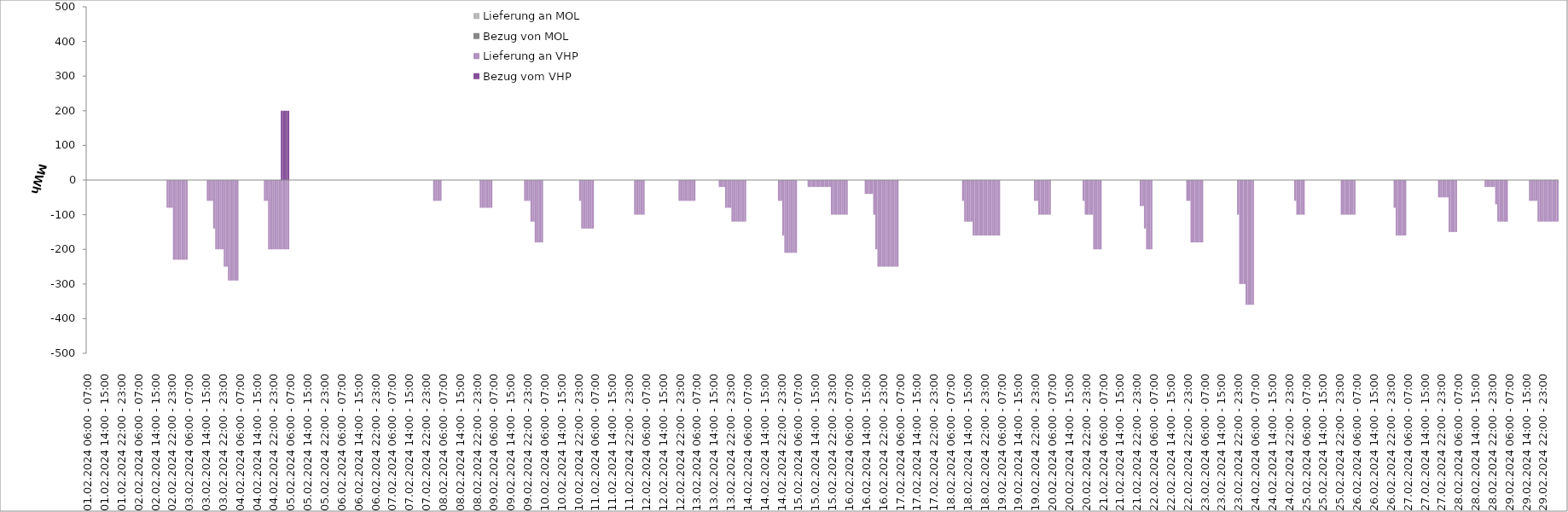
| Category | Bezug vom VHP | Lieferung an VHP | Bezug von MOL | Lieferung an MOL |
|---|---|---|---|---|
| 01.02.2024 06:00 - 07:00 | 0 | 0 | 0 | 0 |
| 01.02.2024 07:00 - 08:00 | 0 | 0 | 0 | 0 |
| 01.02.2024 08:00 - 09:00 | 0 | 0 | 0 | 0 |
| 01.02.2024 09:00 - 10:00 | 0 | 0 | 0 | 0 |
| 01.02.2024 10:00 - 11:00 | 0 | 0 | 0 | 0 |
| 01.02.2024 11:00 - 12:00 | 0 | 0 | 0 | 0 |
| 01.02.2024 12:00 - 13:00 | 0 | 0 | 0 | 0 |
| 01.02.2024 13:00 - 14:00 | 0 | 0 | 0 | 0 |
| 01.02.2024 14:00 - 15:00 | 0 | 0 | 0 | 0 |
| 01.02.2024 15:00 - 16:00 | 0 | 0 | 0 | 0 |
| 01.02.2024 16:00 - 17:00 | 0 | 0 | 0 | 0 |
| 01.02.2024 17:00 - 18:00 | 0 | 0 | 0 | 0 |
| 01.02.2024 18:00 - 19:00 | 0 | 0 | 0 | 0 |
| 01.02.2024 19:00 - 20:00 | 0 | 0 | 0 | 0 |
| 01.02.2024 20:00 - 21:00 | 0 | 0 | 0 | 0 |
| 01.02.2024 21:00 - 22:00 | 0 | 0 | 0 | 0 |
| 01.02.2024 22:00 - 23:00 | 0 | 0 | 0 | 0 |
| 01.02.2024 23:00 - 24:00 | 0 | 0 | 0 | 0 |
| 02.02.2024 00:00 - 01:00 | 0 | 0 | 0 | 0 |
| 02.02.2024 01:00 - 02:00 | 0 | 0 | 0 | 0 |
| 02.02.2024 02:00 - 03:00 | 0 | 0 | 0 | 0 |
| 02.02.2024 03:00 - 04:00 | 0 | 0 | 0 | 0 |
| 02.02.2024 04:00 - 05:00 | 0 | 0 | 0 | 0 |
| 02.02.2024 05:00 - 06:00 | 0 | 0 | 0 | 0 |
| 02.02.2024 06:00 - 07:00 | 0 | 0 | 0 | 0 |
| 02.02.2024 07:00 - 08:00 | 0 | 0 | 0 | 0 |
| 02.02.2024 08:00 - 09:00 | 0 | 0 | 0 | 0 |
| 02.02.2024 09:00 - 10:00 | 0 | 0 | 0 | 0 |
| 02.02.2024 10:00 - 11:00 | 0 | 0 | 0 | 0 |
| 02.02.2024 11:00 - 12:00 | 0 | 0 | 0 | 0 |
| 02.02.2024 12:00 - 13:00 | 0 | 0 | 0 | 0 |
| 02.02.2024 13:00 - 14:00 | 0 | 0 | 0 | 0 |
| 02.02.2024 14:00 - 15:00 | 0 | 0 | 0 | 0 |
| 02.02.2024 15:00 - 16:00 | 0 | 0 | 0 | 0 |
| 02.02.2024 16:00 - 17:00 | 0 | 0 | 0 | 0 |
| 02.02.2024 17:00 - 18:00 | 0 | 0 | 0 | 0 |
| 02.02.2024 18:00 - 19:00 | 0 | 0 | 0 | 0 |
| 02.02.2024 19:00 - 20:00 | 0 | 0 | 0 | 0 |
| 02.02.2024 20:00 - 21:00 | 0 | -80 | 0 | 0 |
| 02.02.2024 21:00 - 22:00 | 0 | -80 | 0 | 0 |
| 02.02.2024 22:00 - 23:00 | 0 | -80 | 0 | 0 |
| 02.02.2024 23:00 - 24:00 | 0 | -230 | 0 | 0 |
| 03.02.2024 00:00 - 01:00 | 0 | -230 | 0 | 0 |
| 03.02.2024 01:00 - 02:00 | 0 | -230 | 0 | 0 |
| 03.02.2024 02:00 - 03:00 | 0 | -230 | 0 | 0 |
| 03.02.2024 03:00 - 04:00 | 0 | -230 | 0 | 0 |
| 03.02.2024 04:00 - 05:00 | 0 | -230 | 0 | 0 |
| 03.02.2024 05:00 - 06:00 | 0 | -230 | 0 | 0 |
| 03.02.2024 06:00 - 07:00 | 0 | 0 | 0 | 0 |
| 03.02.2024 07:00 - 08:00 | 0 | 0 | 0 | 0 |
| 03.02.2024 08:00 - 09:00 | 0 | 0 | 0 | 0 |
| 03.02.2024 09:00 - 10:00 | 0 | 0 | 0 | 0 |
| 03.02.2024 10:00 - 11:00 | 0 | 0 | 0 | 0 |
| 03.02.2024 11:00 - 12:00 | 0 | 0 | 0 | 0 |
| 03.02.2024 12:00 - 13:00 | 0 | 0 | 0 | 0 |
| 03.02.2024 13:00 - 14:00 | 0 | 0 | 0 | 0 |
| 03.02.2024 14:00 - 15:00 | 0 | 0 | 0 | 0 |
| 03.02.2024 15:00 - 16:00 | 0 | -60 | 0 | 0 |
| 03.02.2024 16:00 - 17:00 | 0 | -60 | 0 | 0 |
| 03.02.2024 17:00 - 18:00 | 0 | -60 | 0 | 0 |
| 03.02.2024 18:00 - 19:00 | 0 | -140 | 0 | 0 |
| 03.02.2024 19:00 - 20:00 | 0 | -200 | 0 | 0 |
| 03.02.2024 20:00 - 21:00 | 0 | -200 | 0 | 0 |
| 03.02.2024 21:00 - 22:00 | 0 | -200 | 0 | 0 |
| 03.02.2024 22:00 - 23:00 | 0 | -200 | 0 | 0 |
| 03.02.2024 23:00 - 24:00 | 0 | -250 | 0 | 0 |
| 04.02.2024 00:00 - 01:00 | 0 | -250 | 0 | 0 |
| 04.02.2024 01:00 - 02:00 | 0 | -290 | 0 | 0 |
| 04.02.2024 02:00 - 03:00 | 0 | -290 | 0 | 0 |
| 04.02.2024 03:00 - 04:00 | 0 | -290 | 0 | 0 |
| 04.02.2024 04:00 - 05:00 | 0 | -290 | 0 | 0 |
| 04.02.2024 05:00 - 06:00 | 0 | -290 | 0 | 0 |
| 04.02.2024 06:00 - 07:00 | 0 | 0 | 0 | 0 |
| 04.02.2024 07:00 - 08:00 | 0 | 0 | 0 | 0 |
| 04.02.2024 08:00 - 09:00 | 0 | 0 | 0 | 0 |
| 04.02.2024 09:00 - 10:00 | 0 | 0 | 0 | 0 |
| 04.02.2024 10:00 - 11:00 | 0 | 0 | 0 | 0 |
| 04.02.2024 11:00 - 12:00 | 0 | 0 | 0 | 0 |
| 04.02.2024 12:00 - 13:00 | 0 | 0 | 0 | 0 |
| 04.02.2024 13:00 - 14:00 | 0 | 0 | 0 | 0 |
| 04.02.2024 14:00 - 15:00 | 0 | 0 | 0 | 0 |
| 04.02.2024 15:00 - 16:00 | 0 | 0 | 0 | 0 |
| 04.02.2024 16:00 - 17:00 | 0 | 0 | 0 | 0 |
| 04.02.2024 17:00 - 18:00 | 0 | 0 | 0 | 0 |
| 04.02.2024 18:00 - 19:00 | 0 | -60 | 0 | 0 |
| 04.02.2024 19:00 - 20:00 | 0 | -60 | 0 | 0 |
| 04.02.2024 20:00 - 21:00 | 0 | -200 | 0 | 0 |
| 04.02.2024 21:00 - 22:00 | 0 | -200 | 0 | 0 |
| 04.02.2024 22:00 - 23:00 | 0 | -200 | 0 | 0 |
| 04.02.2024 23:00 - 24:00 | 0 | -200 | 0 | 0 |
| 05.02.2024 00:00 - 01:00 | 0 | -200 | 0 | 0 |
| 05.02.2024 01:00 - 02:00 | 0 | -200 | 0 | 0 |
| 05.02.2024 02:00 - 03:00 | 200 | -200 | 0 | 0 |
| 05.02.2024 03:00 - 04:00 | 200 | -200 | 0 | 0 |
| 05.02.2024 04:00 - 05:00 | 200 | -200 | 0 | 0 |
| 05.02.2024 05:00 - 06:00 | 200 | -200 | 0 | 0 |
| 05.02.2024 06:00 - 07:00 | 0 | 0 | 0 | 0 |
| 05.02.2024 07:00 - 08:00 | 0 | 0 | 0 | 0 |
| 05.02.2024 08:00 - 09:00 | 0 | 0 | 0 | 0 |
| 05.02.2024 09:00 - 10:00 | 0 | 0 | 0 | 0 |
| 05.02.2024 10:00 - 11:00 | 0 | 0 | 0 | 0 |
| 05.02.2024 11:00 - 12:00 | 0 | 0 | 0 | 0 |
| 05.02.2024 12:00 - 13:00 | 0 | 0 | 0 | 0 |
| 05.02.2024 13:00 - 14:00 | 0 | 0 | 0 | 0 |
| 05.02.2024 14:00 - 15:00 | 0 | 0 | 0 | 0 |
| 05.02.2024 15:00 - 16:00 | 0 | 0 | 0 | 0 |
| 05.02.2024 16:00 - 17:00 | 0 | 0 | 0 | 0 |
| 05.02.2024 17:00 - 18:00 | 0 | 0 | 0 | 0 |
| 05.02.2024 18:00 - 19:00 | 0 | 0 | 0 | 0 |
| 05.02.2024 19:00 - 20:00 | 0 | 0 | 0 | 0 |
| 05.02.2024 20:00 - 21:00 | 0 | 0 | 0 | 0 |
| 05.02.2024 21:00 - 22:00 | 0 | 0 | 0 | 0 |
| 05.02.2024 22:00 - 23:00 | 0 | 0 | 0 | 0 |
| 05.02.2024 23:00 - 24:00 | 0 | 0 | 0 | 0 |
| 06.02.2024 00:00 - 01:00 | 0 | 0 | 0 | 0 |
| 06.02.2024 01:00 - 02:00 | 0 | 0 | 0 | 0 |
| 06.02.2024 02:00 - 03:00 | 0 | 0 | 0 | 0 |
| 06.02.2024 03:00 - 04:00 | 0 | 0 | 0 | 0 |
| 06.02.2024 04:00 - 05:00 | 0 | 0 | 0 | 0 |
| 06.02.2024 05:00 - 06:00 | 0 | 0 | 0 | 0 |
| 06.02.2024 06:00 - 07:00 | 0 | 0 | 0 | 0 |
| 06.02.2024 07:00 - 08:00 | 0 | 0 | 0 | 0 |
| 06.02.2024 08:00 - 09:00 | 0 | 0 | 0 | 0 |
| 06.02.2024 09:00 - 10:00 | 0 | 0 | 0 | 0 |
| 06.02.2024 10:00 - 11:00 | 0 | 0 | 0 | 0 |
| 06.02.2024 11:00 - 12:00 | 0 | 0 | 0 | 0 |
| 06.02.2024 12:00 - 13:00 | 0 | 0 | 0 | 0 |
| 06.02.2024 13:00 - 14:00 | 0 | 0 | 0 | 0 |
| 06.02.2024 14:00 - 15:00 | 0 | 0 | 0 | 0 |
| 06.02.2024 15:00 - 16:00 | 0 | 0 | 0 | 0 |
| 06.02.2024 16:00 - 17:00 | 0 | 0 | 0 | 0 |
| 06.02.2024 17:00 - 18:00 | 0 | 0 | 0 | 0 |
| 06.02.2024 18:00 - 19:00 | 0 | 0 | 0 | 0 |
| 06.02.2024 19:00 - 20:00 | 0 | 0 | 0 | 0 |
| 06.02.2024 20:00 - 21:00 | 0 | 0 | 0 | 0 |
| 06.02.2024 21:00 - 22:00 | 0 | 0 | 0 | 0 |
| 06.02.2024 22:00 - 23:00 | 0 | 0 | 0 | 0 |
| 06.02.2024 23:00 - 24:00 | 0 | 0 | 0 | 0 |
| 07.02.2024 00:00 - 01:00 | 0 | 0 | 0 | 0 |
| 07.02.2024 01:00 - 02:00 | 0 | 0 | 0 | 0 |
| 07.02.2024 02:00 - 03:00 | 0 | 0 | 0 | 0 |
| 07.02.2024 03:00 - 04:00 | 0 | 0 | 0 | 0 |
| 07.02.2024 04:00 - 05:00 | 0 | 0 | 0 | 0 |
| 07.02.2024 05:00 - 06:00 | 0 | 0 | 0 | 0 |
| 07.02.2024 06:00 - 07:00 | 0 | 0 | 0 | 0 |
| 07.02.2024 07:00 - 08:00 | 0 | 0 | 0 | 0 |
| 07.02.2024 08:00 - 09:00 | 0 | 0 | 0 | 0 |
| 07.02.2024 09:00 - 10:00 | 0 | 0 | 0 | 0 |
| 07.02.2024 10:00 - 11:00 | 0 | 0 | 0 | 0 |
| 07.02.2024 11:00 - 12:00 | 0 | 0 | 0 | 0 |
| 07.02.2024 12:00 - 13:00 | 0 | 0 | 0 | 0 |
| 07.02.2024 13:00 - 14:00 | 0 | 0 | 0 | 0 |
| 07.02.2024 14:00 - 15:00 | 0 | 0 | 0 | 0 |
| 07.02.2024 15:00 - 16:00 | 0 | 0 | 0 | 0 |
| 07.02.2024 16:00 - 17:00 | 0 | 0 | 0 | 0 |
| 07.02.2024 17:00 - 18:00 | 0 | 0 | 0 | 0 |
| 07.02.2024 18:00 - 19:00 | 0 | 0 | 0 | 0 |
| 07.02.2024 19:00 - 20:00 | 0 | 0 | 0 | 0 |
| 07.02.2024 20:00 - 21:00 | 0 | 0 | 0 | 0 |
| 07.02.2024 21:00 - 22:00 | 0 | 0 | 0 | 0 |
| 07.02.2024 22:00 - 23:00 | 0 | 0 | 0 | 0 |
| 07.02.2024 23:00 - 24:00 | 0 | 0 | 0 | 0 |
| 08.02.2024 00:00 - 01:00 | 0 | 0 | 0 | 0 |
| 08.02.2024 01:00 - 02:00 | 0 | 0 | 0 | 0 |
| 08.02.2024 02:00 - 03:00 | 0 | -60 | 0 | 0 |
| 08.02.2024 03:00 - 04:00 | 0 | -60 | 0 | 0 |
| 08.02.2024 04:00 - 05:00 | 0 | -60 | 0 | 0 |
| 08.02.2024 05:00 - 06:00 | 0 | -60 | 0 | 0 |
| 08.02.2024 06:00 - 07:00 | 0 | 0 | 0 | 0 |
| 08.02.2024 07:00 - 08:00 | 0 | 0 | 0 | 0 |
| 08.02.2024 08:00 - 09:00 | 0 | 0 | 0 | 0 |
| 08.02.2024 09:00 - 10:00 | 0 | 0 | 0 | 0 |
| 08.02.2024 10:00 - 11:00 | 0 | 0 | 0 | 0 |
| 08.02.2024 11:00 - 12:00 | 0 | 0 | 0 | 0 |
| 08.02.2024 12:00 - 13:00 | 0 | 0 | 0 | 0 |
| 08.02.2024 13:00 - 14:00 | 0 | 0 | 0 | 0 |
| 08.02.2024 14:00 - 15:00 | 0 | 0 | 0 | 0 |
| 08.02.2024 15:00 - 16:00 | 0 | 0 | 0 | 0 |
| 08.02.2024 16:00 - 17:00 | 0 | 0 | 0 | 0 |
| 08.02.2024 17:00 - 18:00 | 0 | 0 | 0 | 0 |
| 08.02.2024 18:00 - 19:00 | 0 | 0 | 0 | 0 |
| 08.02.2024 19:00 - 20:00 | 0 | 0 | 0 | 0 |
| 08.02.2024 20:00 - 21:00 | 0 | 0 | 0 | 0 |
| 08.02.2024 21:00 - 22:00 | 0 | 0 | 0 | 0 |
| 08.02.2024 22:00 - 23:00 | 0 | 0 | 0 | 0 |
| 08.02.2024 23:00 - 24:00 | 0 | 0 | 0 | 0 |
| 09.02.2024 00:00 - 01:00 | 0 | -80 | 0 | 0 |
| 09.02.2024 01:00 - 02:00 | 0 | -80 | 0 | 0 |
| 09.02.2024 02:00 - 03:00 | 0 | -80 | 0 | 0 |
| 09.02.2024 03:00 - 04:00 | 0 | -80 | 0 | 0 |
| 09.02.2024 04:00 - 05:00 | 0 | -80 | 0 | 0 |
| 09.02.2024 05:00 - 06:00 | 0 | -80 | 0 | 0 |
| 09.02.2024 06:00 - 07:00 | 0 | 0 | 0 | 0 |
| 09.02.2024 07:00 - 08:00 | 0 | 0 | 0 | 0 |
| 09.02.2024 08:00 - 09:00 | 0 | 0 | 0 | 0 |
| 09.02.2024 09:00 - 10:00 | 0 | 0 | 0 | 0 |
| 09.02.2024 10:00 - 11:00 | 0 | 0 | 0 | 0 |
| 09.02.2024 11:00 - 12:00 | 0 | 0 | 0 | 0 |
| 09.02.2024 12:00 - 13:00 | 0 | 0 | 0 | 0 |
| 09.02.2024 13:00 - 14:00 | 0 | 0 | 0 | 0 |
| 09.02.2024 14:00 - 15:00 | 0 | 0 | 0 | 0 |
| 09.02.2024 15:00 - 16:00 | 0 | 0 | 0 | 0 |
| 09.02.2024 16:00 - 17:00 | 0 | 0 | 0 | 0 |
| 09.02.2024 17:00 - 18:00 | 0 | 0 | 0 | 0 |
| 09.02.2024 18:00 - 19:00 | 0 | 0 | 0 | 0 |
| 09.02.2024 19:00 - 20:00 | 0 | 0 | 0 | 0 |
| 09.02.2024 20:00 - 21:00 | 0 | 0 | 0 | 0 |
| 09.02.2024 21:00 - 22:00 | 0 | -60 | 0 | 0 |
| 09.02.2024 22:00 - 23:00 | 0 | -60 | 0 | 0 |
| 09.02.2024 23:00 - 24:00 | 0 | -60 | 0 | 0 |
| 10.02.2024 00:00 - 01:00 | 0 | -120 | 0 | 0 |
| 10.02.2024 01:00 - 02:00 | 0 | -120 | 0 | 0 |
| 10.02.2024 02:00 - 03:00 | 0 | -180 | 0 | 0 |
| 10.02.2024 03:00 - 04:00 | 0 | -180 | 0 | 0 |
| 10.02.2024 04:00 - 05:00 | 0 | -180 | 0 | 0 |
| 10.02.2024 05:00 - 06:00 | 0 | -180 | 0 | 0 |
| 10.02.2024 06:00 - 07:00 | 0 | 0 | 0 | 0 |
| 10.02.2024 07:00 - 08:00 | 0 | 0 | 0 | 0 |
| 10.02.2024 08:00 - 09:00 | 0 | 0 | 0 | 0 |
| 10.02.2024 09:00 - 10:00 | 0 | 0 | 0 | 0 |
| 10.02.2024 10:00 - 11:00 | 0 | 0 | 0 | 0 |
| 10.02.2024 11:00 - 12:00 | 0 | 0 | 0 | 0 |
| 10.02.2024 12:00 - 13:00 | 0 | 0 | 0 | 0 |
| 10.02.2024 13:00 - 14:00 | 0 | 0 | 0 | 0 |
| 10.02.2024 14:00 - 15:00 | 0 | 0 | 0 | 0 |
| 10.02.2024 15:00 - 16:00 | 0 | 0 | 0 | 0 |
| 10.02.2024 16:00 - 17:00 | 0 | 0 | 0 | 0 |
| 10.02.2024 17:00 - 18:00 | 0 | 0 | 0 | 0 |
| 10.02.2024 18:00 - 19:00 | 0 | 0 | 0 | 0 |
| 10.02.2024 19:00 - 20:00 | 0 | 0 | 0 | 0 |
| 10.02.2024 20:00 - 21:00 | 0 | 0 | 0 | 0 |
| 10.02.2024 21:00 - 22:00 | 0 | 0 | 0 | 0 |
| 10.02.2024 22:00 - 23:00 | 0 | 0 | 0 | 0 |
| 10.02.2024 23:00 - 24:00 | 0 | -60 | 0 | 0 |
| 11.02.2024 00:00 - 01:00 | 0 | -140 | 0 | 0 |
| 11.02.2024 01:00 - 02:00 | 0 | -140 | 0 | 0 |
| 11.02.2024 02:00 - 03:00 | 0 | -140 | 0 | 0 |
| 11.02.2024 03:00 - 04:00 | 0 | -140 | 0 | 0 |
| 11.02.2024 04:00 - 05:00 | 0 | -140 | 0 | 0 |
| 11.02.2024 05:00 - 06:00 | 0 | -140 | 0 | 0 |
| 11.02.2024 06:00 - 07:00 | 0 | 0 | 0 | 0 |
| 11.02.2024 07:00 - 08:00 | 0 | 0 | 0 | 0 |
| 11.02.2024 08:00 - 09:00 | 0 | 0 | 0 | 0 |
| 11.02.2024 09:00 - 10:00 | 0 | 0 | 0 | 0 |
| 11.02.2024 10:00 - 11:00 | 0 | 0 | 0 | 0 |
| 11.02.2024 11:00 - 12:00 | 0 | 0 | 0 | 0 |
| 11.02.2024 12:00 - 13:00 | 0 | 0 | 0 | 0 |
| 11.02.2024 13:00 - 14:00 | 0 | 0 | 0 | 0 |
| 11.02.2024 14:00 - 15:00 | 0 | 0 | 0 | 0 |
| 11.02.2024 15:00 - 16:00 | 0 | 0 | 0 | 0 |
| 11.02.2024 16:00 - 17:00 | 0 | 0 | 0 | 0 |
| 11.02.2024 17:00 - 18:00 | 0 | 0 | 0 | 0 |
| 11.02.2024 18:00 - 19:00 | 0 | 0 | 0 | 0 |
| 11.02.2024 19:00 - 20:00 | 0 | 0 | 0 | 0 |
| 11.02.2024 20:00 - 21:00 | 0 | 0 | 0 | 0 |
| 11.02.2024 21:00 - 22:00 | 0 | 0 | 0 | 0 |
| 11.02.2024 22:00 - 23:00 | 0 | 0 | 0 | 0 |
| 11.02.2024 23:00 - 24:00 | 0 | 0 | 0 | 0 |
| 12.02.2024 00:00 - 01:00 | 0 | 0 | 0 | 0 |
| 12.02.2024 01:00 - 02:00 | 0 | -100 | 0 | 0 |
| 12.02.2024 02:00 - 03:00 | 0 | -100 | 0 | 0 |
| 12.02.2024 03:00 - 04:00 | 0 | -100 | 0 | 0 |
| 12.02.2024 04:00 - 05:00 | 0 | -100 | 0 | 0 |
| 12.02.2024 05:00 - 06:00 | 0 | -100 | 0 | 0 |
| 12.02.2024 06:00 - 07:00 | 0 | 0 | 0 | 0 |
| 12.02.2024 07:00 - 08:00 | 0 | 0 | 0 | 0 |
| 12.02.2024 08:00 - 09:00 | 0 | 0 | 0 | 0 |
| 12.02.2024 09:00 - 10:00 | 0 | 0 | 0 | 0 |
| 12.02.2024 10:00 - 11:00 | 0 | 0 | 0 | 0 |
| 12.02.2024 11:00 - 12:00 | 0 | 0 | 0 | 0 |
| 12.02.2024 12:00 - 13:00 | 0 | 0 | 0 | 0 |
| 12.02.2024 13:00 - 14:00 | 0 | 0 | 0 | 0 |
| 12.02.2024 14:00 - 15:00 | 0 | 0 | 0 | 0 |
| 12.02.2024 15:00 - 16:00 | 0 | 0 | 0 | 0 |
| 12.02.2024 16:00 - 17:00 | 0 | 0 | 0 | 0 |
| 12.02.2024 17:00 - 18:00 | 0 | 0 | 0 | 0 |
| 12.02.2024 18:00 - 19:00 | 0 | 0 | 0 | 0 |
| 12.02.2024 19:00 - 20:00 | 0 | 0 | 0 | 0 |
| 12.02.2024 20:00 - 21:00 | 0 | 0 | 0 | 0 |
| 12.02.2024 21:00 - 22:00 | 0 | 0 | 0 | 0 |
| 12.02.2024 22:00 - 23:00 | 0 | -60 | 0 | 0 |
| 12.02.2024 23:00 - 24:00 | 0 | -60 | 0 | 0 |
| 13.02.2024 00:00 - 01:00 | 0 | -60 | 0 | 0 |
| 13.02.2024 01:00 - 02:00 | 0 | -60 | 0 | 0 |
| 13.02.2024 02:00 - 03:00 | 0 | -60 | 0 | 0 |
| 13.02.2024 03:00 - 04:00 | 0 | -60 | 0 | 0 |
| 13.02.2024 04:00 - 05:00 | 0 | -60 | 0 | 0 |
| 13.02.2024 05:00 - 06:00 | 0 | -60 | 0 | 0 |
| 13.02.2024 06:00 - 07:00 | 0 | 0 | 0 | 0 |
| 13.02.2024 07:00 - 08:00 | 0 | 0 | 0 | 0 |
| 13.02.2024 08:00 - 09:00 | 0 | 0 | 0 | 0 |
| 13.02.2024 09:00 - 10:00 | 0 | 0 | 0 | 0 |
| 13.02.2024 10:00 - 11:00 | 0 | 0 | 0 | 0 |
| 13.02.2024 11:00 - 12:00 | 0 | 0 | 0 | 0 |
| 13.02.2024 12:00 - 13:00 | 0 | 0 | 0 | 0 |
| 13.02.2024 13:00 - 14:00 | 0 | 0 | 0 | 0 |
| 13.02.2024 14:00 - 15:00 | 0 | 0 | 0 | 0 |
| 13.02.2024 15:00 - 16:00 | 0 | 0 | 0 | 0 |
| 13.02.2024 16:00 - 17:00 | 0 | 0 | 0 | 0 |
| 13.02.2024 17:00 - 18:00 | 0 | -20 | 0 | 0 |
| 13.02.2024 18:00 - 19:00 | 0 | -20 | 0 | 0 |
| 13.02.2024 19:00 - 20:00 | 0 | -20 | 0 | 0 |
| 13.02.2024 20:00 - 21:00 | 0 | -80 | 0 | 0 |
| 13.02.2024 21:00 - 22:00 | 0 | -80 | 0 | 0 |
| 13.02.2024 22:00 - 23:00 | 0 | -80 | 0 | 0 |
| 13.02.2024 23:00 - 24:00 | 0 | -120 | 0 | 0 |
| 14.02.2024 00:00 - 01:00 | 0 | -120 | 0 | 0 |
| 14.02.2024 01:00 - 02:00 | 0 | -120 | 0 | 0 |
| 14.02.2024 02:00 - 03:00 | 0 | -120 | 0 | 0 |
| 14.02.2024 03:00 - 04:00 | 0 | -120 | 0 | 0 |
| 14.02.2024 04:00 - 05:00 | 0 | -120 | 0 | 0 |
| 14.02.2024 05:00 - 06:00 | 0 | -120 | 0 | 0 |
| 14.02.2024 06:00 - 07:00 | 0 | 0 | 0 | 0 |
| 14.02.2024 07:00 - 08:00 | 0 | 0 | 0 | 0 |
| 14.02.2024 08:00 - 09:00 | 0 | 0 | 0 | 0 |
| 14.02.2024 09:00 - 10:00 | 0 | 0 | 0 | 0 |
| 14.02.2024 10:00 - 11:00 | 0 | 0 | 0 | 0 |
| 14.02.2024 11:00 - 12:00 | 0 | 0 | 0 | 0 |
| 14.02.2024 12:00 - 13:00 | 0 | 0 | 0 | 0 |
| 14.02.2024 13:00 - 14:00 | 0 | 0 | 0 | 0 |
| 14.02.2024 14:00 - 15:00 | 0 | 0 | 0 | 0 |
| 14.02.2024 15:00 - 16:00 | 0 | 0 | 0 | 0 |
| 14.02.2024 16:00 - 17:00 | 0 | 0 | 0 | 0 |
| 14.02.2024 17:00 - 18:00 | 0 | 0 | 0 | 0 |
| 14.02.2024 18:00 - 19:00 | 0 | 0 | 0 | 0 |
| 14.02.2024 19:00 - 20:00 | 0 | 0 | 0 | 0 |
| 14.02.2024 20:00 - 21:00 | 0 | 0 | 0 | 0 |
| 14.02.2024 21:00 - 22:00 | 0 | -60 | 0 | 0 |
| 14.02.2024 22:00 - 23:00 | 0 | -60 | 0 | 0 |
| 14.02.2024 23:00 - 24:00 | 0 | -160 | 0 | 0 |
| 15.02.2024 00:00 - 01:00 | 0 | -210 | 0 | 0 |
| 15.02.2024 01:00 - 02:00 | 0 | -210 | 0 | 0 |
| 15.02.2024 02:00 - 03:00 | 0 | -210 | 0 | 0 |
| 15.02.2024 03:00 - 04:00 | 0 | -210 | 0 | 0 |
| 15.02.2024 04:00 - 05:00 | 0 | -210 | 0 | 0 |
| 15.02.2024 05:00 - 06:00 | 0 | -210 | 0 | 0 |
| 15.02.2024 06:00 - 07:00 | 0 | 0 | 0 | 0 |
| 15.02.2024 07:00 - 08:00 | 0 | 0 | 0 | 0 |
| 15.02.2024 08:00 - 09:00 | 0 | 0 | 0 | 0 |
| 15.02.2024 09:00 - 10:00 | 0 | 0 | 0 | 0 |
| 15.02.2024 10:00 - 11:00 | 0 | 0 | 0 | 0 |
| 15.02.2024 11:00 - 12:00 | 0 | -20 | 0 | 0 |
| 15.02.2024 12:00 - 13:00 | 0 | -20 | 0 | 0 |
| 15.02.2024 13:00 - 14:00 | 0 | -20 | 0 | 0 |
| 15.02.2024 14:00 - 15:00 | 0 | -20 | 0 | 0 |
| 15.02.2024 15:00 - 16:00 | 0 | -20 | 0 | 0 |
| 15.02.2024 16:00 - 17:00 | 0 | -20 | 0 | 0 |
| 15.02.2024 17:00 - 18:00 | 0 | -20 | 0 | 0 |
| 15.02.2024 18:00 - 19:00 | 0 | -20 | 0 | 0 |
| 15.02.2024 19:00 - 20:00 | 0 | -20 | 0 | 0 |
| 15.02.2024 20:00 - 21:00 | 0 | -20 | 0 | 0 |
| 15.02.2024 21:00 - 22:00 | 0 | -20 | 0 | 0 |
| 15.02.2024 22:00 - 23:00 | 0 | -100 | 0 | 0 |
| 15.02.2024 23:00 - 24:00 | 0 | -100 | 0 | 0 |
| 16.02.2024 00:00 - 01:00 | 0 | -100 | 0 | 0 |
| 16.02.2024 01:00 - 02:00 | 0 | -100 | 0 | 0 |
| 16.02.2024 02:00 - 03:00 | 0 | -100 | 0 | 0 |
| 16.02.2024 03:00 - 04:00 | 0 | -100 | 0 | 0 |
| 16.02.2024 04:00 - 05:00 | 0 | -100 | 0 | 0 |
| 16.02.2024 05:00 - 06:00 | 0 | -100 | 0 | 0 |
| 16.02.2024 06:00 - 07:00 | 0 | 0 | 0 | 0 |
| 16.02.2024 07:00 - 08:00 | 0 | 0 | 0 | 0 |
| 16.02.2024 08:00 - 09:00 | 0 | 0 | 0 | 0 |
| 16.02.2024 09:00 - 10:00 | 0 | 0 | 0 | 0 |
| 16.02.2024 10:00 - 11:00 | 0 | 0 | 0 | 0 |
| 16.02.2024 11:00 - 12:00 | 0 | 0 | 0 | 0 |
| 16.02.2024 12:00 - 13:00 | 0 | 0 | 0 | 0 |
| 16.02.2024 13:00 - 14:00 | 0 | 0 | 0 | 0 |
| 16.02.2024 14:00 - 15:00 | 0 | -40 | 0 | 0 |
| 16.02.2024 15:00 - 16:00 | 0 | -40 | 0 | 0 |
| 16.02.2024 16:00 - 17:00 | 0 | -40 | 0 | 0 |
| 16.02.2024 17:00 - 18:00 | 0 | -40 | 0 | 0 |
| 16.02.2024 18:00 - 19:00 | 0 | -100 | 0 | 0 |
| 16.02.2024 19:00 - 20:00 | 0 | -200 | 0 | 0 |
| 16.02.2024 20:00 - 21:00 | 0 | -250 | 0 | 0 |
| 16.02.2024 21:00 - 22:00 | 0 | -250 | 0 | 0 |
| 16.02.2024 22:00 - 23:00 | 0 | -250 | 0 | 0 |
| 16.02.2024 23:00 - 24:00 | 0 | -250 | 0 | 0 |
| 17.02.2024 00:00 - 01:00 | 0 | -250 | 0 | 0 |
| 17.02.2024 01:00 - 02:00 | 0 | -250 | 0 | 0 |
| 17.02.2024 02:00 - 03:00 | 0 | -250 | 0 | 0 |
| 17.02.2024 03:00 - 04:00 | 0 | -250 | 0 | 0 |
| 17.02.2024 04:00 - 05:00 | 0 | -250 | 0 | 0 |
| 17.02.2024 05:00 - 06:00 | 0 | -250 | 0 | 0 |
| 17.02.2024 06:00 - 07:00 | 0 | 0 | 0 | 0 |
| 17.02.2024 07:00 - 08:00 | 0 | 0 | 0 | 0 |
| 17.02.2024 08:00 - 09:00 | 0 | 0 | 0 | 0 |
| 17.02.2024 09:00 - 10:00 | 0 | 0 | 0 | 0 |
| 17.02.2024 10:00 - 11:00 | 0 | 0 | 0 | 0 |
| 17.02.2024 11:00 - 12:00 | 0 | 0 | 0 | 0 |
| 17.02.2024 12:00 - 13:00 | 0 | 0 | 0 | 0 |
| 17.02.2024 13:00 - 14:00 | 0 | 0 | 0 | 0 |
| 17.02.2024 14:00 - 15:00 | 0 | 0 | 0 | 0 |
| 17.02.2024 15:00 - 16:00 | 0 | 0 | 0 | 0 |
| 17.02.2024 16:00 - 17:00 | 0 | 0 | 0 | 0 |
| 17.02.2024 17:00 - 18:00 | 0 | 0 | 0 | 0 |
| 17.02.2024 18:00 - 19:00 | 0 | 0 | 0 | 0 |
| 17.02.2024 19:00 - 20:00 | 0 | 0 | 0 | 0 |
| 17.02.2024 20:00 - 21:00 | 0 | 0 | 0 | 0 |
| 17.02.2024 21:00 - 22:00 | 0 | 0 | 0 | 0 |
| 17.02.2024 22:00 - 23:00 | 0 | 0 | 0 | 0 |
| 17.02.2024 23:00 - 24:00 | 0 | 0 | 0 | 0 |
| 18.02.2024 00:00 - 01:00 | 0 | 0 | 0 | 0 |
| 18.02.2024 01:00 - 02:00 | 0 | 0 | 0 | 0 |
| 18.02.2024 02:00 - 03:00 | 0 | 0 | 0 | 0 |
| 18.02.2024 03:00 - 04:00 | 0 | 0 | 0 | 0 |
| 18.02.2024 04:00 - 05:00 | 0 | 0 | 0 | 0 |
| 18.02.2024 05:00 - 06:00 | 0 | 0 | 0 | 0 |
| 18.02.2024 06:00 - 07:00 | 0 | 0 | 0 | 0 |
| 18.02.2024 07:00 - 08:00 | 0 | 0 | 0 | 0 |
| 18.02.2024 08:00 - 09:00 | 0 | 0 | 0 | 0 |
| 18.02.2024 09:00 - 10:00 | 0 | 0 | 0 | 0 |
| 18.02.2024 10:00 - 11:00 | 0 | 0 | 0 | 0 |
| 18.02.2024 11:00 - 12:00 | 0 | 0 | 0 | 0 |
| 18.02.2024 12:00 - 13:00 | 0 | -60 | 0 | 0 |
| 18.02.2024 13:00 - 14:00 | 0 | -120 | 0 | 0 |
| 18.02.2024 14:00 - 15:00 | 0 | -120 | 0 | 0 |
| 18.02.2024 15:00 - 16:00 | 0 | -120 | 0 | 0 |
| 18.02.2024 16:00 - 17:00 | 0 | -120 | 0 | 0 |
| 18.02.2024 17:00 - 18:00 | 0 | -160 | 0 | 0 |
| 18.02.2024 18:00 - 19:00 | 0 | -160 | 0 | 0 |
| 18.02.2024 19:00 - 20:00 | 0 | -160 | 0 | 0 |
| 18.02.2024 20:00 - 21:00 | 0 | -160 | 0 | 0 |
| 18.02.2024 21:00 - 22:00 | 0 | -160 | 0 | 0 |
| 18.02.2024 22:00 - 23:00 | 0 | -160 | 0 | 0 |
| 18.02.2024 23:00 - 24:00 | 0 | -160 | 0 | 0 |
| 19.02.2024 00:00 - 01:00 | 0 | -160 | 0 | 0 |
| 19.02.2024 01:00 - 02:00 | 0 | -160 | 0 | 0 |
| 19.02.2024 02:00 - 03:00 | 0 | -160 | 0 | 0 |
| 19.02.2024 03:00 - 04:00 | 0 | -160 | 0 | 0 |
| 19.02.2024 04:00 - 05:00 | 0 | -160 | 0 | 0 |
| 19.02.2024 05:00 - 06:00 | 0 | -160 | 0 | 0 |
| 19.02.2024 06:00 - 07:00 | 0 | 0 | 0 | 0 |
| 19.02.2024 07:00 - 08:00 | 0 | 0 | 0 | 0 |
| 19.02.2024 08:00 - 09:00 | 0 | 0 | 0 | 0 |
| 19.02.2024 09:00 - 10:00 | 0 | 0 | 0 | 0 |
| 19.02.2024 10:00 - 11:00 | 0 | 0 | 0 | 0 |
| 19.02.2024 11:00 - 12:00 | 0 | 0 | 0 | 0 |
| 19.02.2024 12:00 - 13:00 | 0 | 0 | 0 | 0 |
| 19.02.2024 13:00 - 14:00 | 0 | 0 | 0 | 0 |
| 19.02.2024 14:00 - 15:00 | 0 | 0 | 0 | 0 |
| 19.02.2024 15:00 - 16:00 | 0 | 0 | 0 | 0 |
| 19.02.2024 16:00 - 17:00 | 0 | 0 | 0 | 0 |
| 19.02.2024 17:00 - 18:00 | 0 | 0 | 0 | 0 |
| 19.02.2024 18:00 - 19:00 | 0 | 0 | 0 | 0 |
| 19.02.2024 19:00 - 20:00 | 0 | 0 | 0 | 0 |
| 19.02.2024 20:00 - 21:00 | 0 | 0 | 0 | 0 |
| 19.02.2024 21:00 - 22:00 | 0 | 0 | 0 | 0 |
| 19.02.2024 22:00 - 23:00 | 0 | -60 | 0 | 0 |
| 19.02.2024 23:00 - 24:00 | 0 | -60 | 0 | 0 |
| 20.02.2024 00:00 - 01:00 | 0 | -100 | 0 | 0 |
| 20.02.2024 01:00 - 02:00 | 0 | -100 | 0 | 0 |
| 20.02.2024 02:00 - 03:00 | 0 | -100 | 0 | 0 |
| 20.02.2024 03:00 - 04:00 | 0 | -100 | 0 | 0 |
| 20.02.2024 04:00 - 05:00 | 0 | -100 | 0 | 0 |
| 20.02.2024 05:00 - 06:00 | 0 | -100 | 0 | 0 |
| 20.02.2024 06:00 - 07:00 | 0 | 0 | 0 | 0 |
| 20.02.2024 07:00 - 08:00 | 0 | 0 | 0 | 0 |
| 20.02.2024 08:00 - 09:00 | 0 | 0 | 0 | 0 |
| 20.02.2024 09:00 - 10:00 | 0 | 0 | 0 | 0 |
| 20.02.2024 10:00 - 11:00 | 0 | 0 | 0 | 0 |
| 20.02.2024 11:00 - 12:00 | 0 | 0 | 0 | 0 |
| 20.02.2024 12:00 - 13:00 | 0 | 0 | 0 | 0 |
| 20.02.2024 13:00 - 14:00 | 0 | 0 | 0 | 0 |
| 20.02.2024 14:00 - 15:00 | 0 | 0 | 0 | 0 |
| 20.02.2024 15:00 - 16:00 | 0 | 0 | 0 | 0 |
| 20.02.2024 16:00 - 17:00 | 0 | 0 | 0 | 0 |
| 20.02.2024 17:00 - 18:00 | 0 | 0 | 0 | 0 |
| 20.02.2024 18:00 - 19:00 | 0 | 0 | 0 | 0 |
| 20.02.2024 19:00 - 20:00 | 0 | 0 | 0 | 0 |
| 20.02.2024 20:00 - 21:00 | 0 | 0 | 0 | 0 |
| 20.02.2024 21:00 - 22:00 | 0 | -60 | 0 | 0 |
| 20.02.2024 22:00 - 23:00 | 0 | -100 | 0 | 0 |
| 20.02.2024 23:00 - 24:00 | 0 | -100 | 0 | 0 |
| 21.02.2024 00:00 - 01:00 | 0 | -100 | 0 | 0 |
| 21.02.2024 01:00 - 02:00 | 0 | -100 | 0 | 0 |
| 21.02.2024 02:00 - 03:00 | 0 | -200 | 0 | 0 |
| 21.02.2024 03:00 - 04:00 | 0 | -200 | 0 | 0 |
| 21.02.2024 04:00 - 05:00 | 0 | -200 | 0 | 0 |
| 21.02.2024 05:00 - 06:00 | 0 | -200 | 0 | 0 |
| 21.02.2024 06:00 - 07:00 | 0 | 0 | 0 | 0 |
| 21.02.2024 07:00 - 08:00 | 0 | 0 | 0 | 0 |
| 21.02.2024 08:00 - 09:00 | 0 | 0 | 0 | 0 |
| 21.02.2024 09:00 - 10:00 | 0 | 0 | 0 | 0 |
| 21.02.2024 10:00 - 11:00 | 0 | 0 | 0 | 0 |
| 21.02.2024 11:00 - 12:00 | 0 | 0 | 0 | 0 |
| 21.02.2024 12:00 - 13:00 | 0 | 0 | 0 | 0 |
| 21.02.2024 13:00 - 14:00 | 0 | 0 | 0 | 0 |
| 21.02.2024 14:00 - 15:00 | 0 | 0 | 0 | 0 |
| 21.02.2024 15:00 - 16:00 | 0 | 0 | 0 | 0 |
| 21.02.2024 16:00 - 17:00 | 0 | 0 | 0 | 0 |
| 21.02.2024 17:00 - 18:00 | 0 | 0 | 0 | 0 |
| 21.02.2024 18:00 - 19:00 | 0 | 0 | 0 | 0 |
| 21.02.2024 19:00 - 20:00 | 0 | 0 | 0 | 0 |
| 21.02.2024 20:00 - 21:00 | 0 | 0 | 0 | 0 |
| 21.02.2024 21:00 - 22:00 | 0 | 0 | 0 | 0 |
| 21.02.2024 22:00 - 23:00 | 0 | 0 | 0 | 0 |
| 21.02.2024 23:00 - 24:00 | 0 | 0 | 0 | 0 |
| 22.02.2024 00:00 - 01:00 | 0 | -75 | 0 | 0 |
| 22.02.2024 01:00 - 02:00 | 0 | -75 | 0 | 0 |
| 22.02.2024 02:00 - 03:00 | 0 | -140 | 0 | 0 |
| 22.02.2024 03:00 - 04:00 | 0 | -200 | 0 | 0 |
| 22.02.2024 04:00 - 05:00 | 0 | -200 | 0 | 0 |
| 22.02.2024 05:00 - 06:00 | 0 | -200 | 0 | 0 |
| 22.02.2024 06:00 - 07:00 | 0 | 0 | 0 | 0 |
| 22.02.2024 07:00 - 08:00 | 0 | 0 | 0 | 0 |
| 22.02.2024 08:00 - 09:00 | 0 | 0 | 0 | 0 |
| 22.02.2024 09:00 - 10:00 | 0 | 0 | 0 | 0 |
| 22.02.2024 10:00 - 11:00 | 0 | 0 | 0 | 0 |
| 22.02.2024 11:00 - 12:00 | 0 | 0 | 0 | 0 |
| 22.02.2024 12:00 - 13:00 | 0 | 0 | 0 | 0 |
| 22.02.2024 13:00 - 14:00 | 0 | 0 | 0 | 0 |
| 22.02.2024 14:00 - 15:00 | 0 | 0 | 0 | 0 |
| 22.02.2024 15:00 - 16:00 | 0 | 0 | 0 | 0 |
| 22.02.2024 16:00 - 17:00 | 0 | 0 | 0 | 0 |
| 22.02.2024 17:00 - 18:00 | 0 | 0 | 0 | 0 |
| 22.02.2024 18:00 - 19:00 | 0 | 0 | 0 | 0 |
| 22.02.2024 19:00 - 20:00 | 0 | 0 | 0 | 0 |
| 22.02.2024 20:00 - 21:00 | 0 | 0 | 0 | 0 |
| 22.02.2024 21:00 - 22:00 | 0 | 0 | 0 | 0 |
| 22.02.2024 22:00 - 23:00 | 0 | -60 | 0 | 0 |
| 22.02.2024 23:00 - 24:00 | 0 | -60 | 0 | 0 |
| 23.02.2024 00:00 - 01:00 | 0 | -180 | 0 | 0 |
| 23.02.2024 01:00 - 02:00 | 0 | -180 | 0 | 0 |
| 23.02.2024 02:00 - 03:00 | 0 | -180 | 0 | 0 |
| 23.02.2024 03:00 - 04:00 | 0 | -180 | 0 | 0 |
| 23.02.2024 04:00 - 05:00 | 0 | -180 | 0 | 0 |
| 23.02.2024 05:00 - 06:00 | 0 | -180 | 0 | 0 |
| 23.02.2024 06:00 - 07:00 | 0 | 0 | 0 | 0 |
| 23.02.2024 07:00 - 08:00 | 0 | 0 | 0 | 0 |
| 23.02.2024 08:00 - 09:00 | 0 | 0 | 0 | 0 |
| 23.02.2024 09:00 - 10:00 | 0 | 0 | 0 | 0 |
| 23.02.2024 10:00 - 11:00 | 0 | 0 | 0 | 0 |
| 23.02.2024 11:00 - 12:00 | 0 | 0 | 0 | 0 |
| 23.02.2024 12:00 - 13:00 | 0 | 0 | 0 | 0 |
| 23.02.2024 13:00 - 14:00 | 0 | 0 | 0 | 0 |
| 23.02.2024 14:00 - 15:00 | 0 | 0 | 0 | 0 |
| 23.02.2024 15:00 - 16:00 | 0 | 0 | 0 | 0 |
| 23.02.2024 16:00 - 17:00 | 0 | 0 | 0 | 0 |
| 23.02.2024 17:00 - 18:00 | 0 | 0 | 0 | 0 |
| 23.02.2024 18:00 - 19:00 | 0 | 0 | 0 | 0 |
| 23.02.2024 19:00 - 20:00 | 0 | 0 | 0 | 0 |
| 23.02.2024 20:00 - 21:00 | 0 | 0 | 0 | 0 |
| 23.02.2024 21:00 - 22:00 | 0 | 0 | 0 | 0 |
| 23.02.2024 22:00 - 23:00 | 0 | -100 | 0 | 0 |
| 23.02.2024 23:00 - 24:00 | 0 | -300 | 0 | 0 |
| 24.02.2024 00:00 - 01:00 | 0 | -300 | 0 | 0 |
| 24.02.2024 01:00 - 02:00 | 0 | -300 | 0 | 0 |
| 24.02.2024 02:00 - 03:00 | 0 | -360 | 0 | 0 |
| 24.02.2024 03:00 - 04:00 | 0 | -360 | 0 | 0 |
| 24.02.2024 04:00 - 05:00 | 0 | -360 | 0 | 0 |
| 24.02.2024 05:00 - 06:00 | 0 | -360 | 0 | 0 |
| 24.02.2024 06:00 - 07:00 | 0 | 0 | 0 | 0 |
| 24.02.2024 07:00 - 08:00 | 0 | 0 | 0 | 0 |
| 24.02.2024 08:00 - 09:00 | 0 | 0 | 0 | 0 |
| 24.02.2024 09:00 - 10:00 | 0 | 0 | 0 | 0 |
| 24.02.2024 10:00 - 11:00 | 0 | 0 | 0 | 0 |
| 24.02.2024 11:00 - 12:00 | 0 | 0 | 0 | 0 |
| 24.02.2024 12:00 - 13:00 | 0 | 0 | 0 | 0 |
| 24.02.2024 13:00 - 14:00 | 0 | 0 | 0 | 0 |
| 24.02.2024 14:00 - 15:00 | 0 | 0 | 0 | 0 |
| 24.02.2024 15:00 - 16:00 | 0 | 0 | 0 | 0 |
| 24.02.2024 16:00 - 17:00 | 0 | 0 | 0 | 0 |
| 24.02.2024 17:00 - 18:00 | 0 | 0 | 0 | 0 |
| 24.02.2024 18:00 - 19:00 | 0 | 0 | 0 | 0 |
| 24.02.2024 19:00 - 20:00 | 0 | 0 | 0 | 0 |
| 24.02.2024 20:00 - 21:00 | 0 | 0 | 0 | 0 |
| 24.02.2024 21:00 - 22:00 | 0 | 0 | 0 | 0 |
| 24.02.2024 22:00 - 23:00 | 0 | 0 | 0 | 0 |
| 24.02.2024 23:00 - 24:00 | 0 | 0 | 0 | 0 |
| 25.02.2024 00:00 - 01:00 | 0 | 0 | 0 | 0 |
| 25.02.2024 01:00 - 02:00 | 0 | -60 | 0 | 0 |
| 25.02.2024 02:00 - 03:00 | 0 | -100 | 0 | 0 |
| 25.02.2024 03:00 - 04:00 | 0 | -100 | 0 | 0 |
| 25.02.2024 04:00 - 05:00 | 0 | -100 | 0 | 0 |
| 25.02.2024 05:00 - 06:00 | 0 | -100 | 0 | 0 |
| 25.02.2024 06:00 - 07:00 | 0 | 0 | 0 | 0 |
| 25.02.2024 07:00 - 08:00 | 0 | 0 | 0 | 0 |
| 25.02.2024 08:00 - 09:00 | 0 | 0 | 0 | 0 |
| 25.02.2024 09:00 - 10:00 | 0 | 0 | 0 | 0 |
| 25.02.2024 10:00 - 11:00 | 0 | 0 | 0 | 0 |
| 25.02.2024 11:00 - 12:00 | 0 | 0 | 0 | 0 |
| 25.02.2024 12:00 - 13:00 | 0 | 0 | 0 | 0 |
| 25.02.2024 13:00 - 14:00 | 0 | 0 | 0 | 0 |
| 25.02.2024 14:00 - 15:00 | 0 | 0 | 0 | 0 |
| 25.02.2024 15:00 - 16:00 | 0 | 0 | 0 | 0 |
| 25.02.2024 16:00 - 17:00 | 0 | 0 | 0 | 0 |
| 25.02.2024 17:00 - 18:00 | 0 | 0 | 0 | 0 |
| 25.02.2024 18:00 - 19:00 | 0 | 0 | 0 | 0 |
| 25.02.2024 19:00 - 20:00 | 0 | 0 | 0 | 0 |
| 25.02.2024 20:00 - 21:00 | 0 | 0 | 0 | 0 |
| 25.02.2024 21:00 - 22:00 | 0 | 0 | 0 | 0 |
| 25.02.2024 22:00 - 23:00 | 0 | 0 | 0 | 0 |
| 25.02.2024 23:00 - 24:00 | 0 | -100 | 0 | 0 |
| 26.02.2024 00:00 - 01:00 | 0 | -100 | 0 | 0 |
| 26.02.2024 01:00 - 02:00 | 0 | -100 | 0 | 0 |
| 26.02.2024 02:00 - 03:00 | 0 | -100 | 0 | 0 |
| 26.02.2024 03:00 - 04:00 | 0 | -100 | 0 | 0 |
| 26.02.2024 04:00 - 05:00 | 0 | -100 | 0 | 0 |
| 26.02.2024 05:00 - 06:00 | 0 | -100 | 0 | 0 |
| 26.02.2024 06:00 - 07:00 | 0 | 0 | 0 | 0 |
| 26.02.2024 07:00 - 08:00 | 0 | 0 | 0 | 0 |
| 26.02.2024 08:00 - 09:00 | 0 | 0 | 0 | 0 |
| 26.02.2024 09:00 - 10:00 | 0 | 0 | 0 | 0 |
| 26.02.2024 10:00 - 11:00 | 0 | 0 | 0 | 0 |
| 26.02.2024 11:00 - 12:00 | 0 | 0 | 0 | 0 |
| 26.02.2024 12:00 - 13:00 | 0 | 0 | 0 | 0 |
| 26.02.2024 13:00 - 14:00 | 0 | 0 | 0 | 0 |
| 26.02.2024 14:00 - 15:00 | 0 | 0 | 0 | 0 |
| 26.02.2024 15:00 - 16:00 | 0 | 0 | 0 | 0 |
| 26.02.2024 16:00 - 17:00 | 0 | 0 | 0 | 0 |
| 26.02.2024 17:00 - 18:00 | 0 | 0 | 0 | 0 |
| 26.02.2024 18:00 - 19:00 | 0 | 0 | 0 | 0 |
| 26.02.2024 19:00 - 20:00 | 0 | 0 | 0 | 0 |
| 26.02.2024 20:00 - 21:00 | 0 | 0 | 0 | 0 |
| 26.02.2024 21:00 - 22:00 | 0 | 0 | 0 | 0 |
| 26.02.2024 22:00 - 23:00 | 0 | 0 | 0 | 0 |
| 26.02.2024 23:00 - 24:00 | 0 | 0 | 0 | 0 |
| 27.02.2024 00:00 - 01:00 | 0 | -80 | 0 | 0 |
| 27.02.2024 01:00 - 02:00 | 0 | -160 | 0 | 0 |
| 27.02.2024 02:00 - 03:00 | 0 | -160 | 0 | 0 |
| 27.02.2024 03:00 - 04:00 | 0 | -160 | 0 | 0 |
| 27.02.2024 04:00 - 05:00 | 0 | -160 | 0 | 0 |
| 27.02.2024 05:00 - 06:00 | 0 | -160 | 0 | 0 |
| 27.02.2024 06:00 - 07:00 | 0 | 0 | 0 | 0 |
| 27.02.2024 07:00 - 08:00 | 0 | 0 | 0 | 0 |
| 27.02.2024 08:00 - 09:00 | 0 | 0 | 0 | 0 |
| 27.02.2024 09:00 - 10:00 | 0 | 0 | 0 | 0 |
| 27.02.2024 10:00 - 11:00 | 0 | 0 | 0 | 0 |
| 27.02.2024 11:00 - 12:00 | 0 | 0 | 0 | 0 |
| 27.02.2024 12:00 - 13:00 | 0 | 0 | 0 | 0 |
| 27.02.2024 13:00 - 14:00 | 0 | 0 | 0 | 0 |
| 27.02.2024 14:00 - 15:00 | 0 | 0 | 0 | 0 |
| 27.02.2024 15:00 - 16:00 | 0 | 0 | 0 | 0 |
| 27.02.2024 16:00 - 17:00 | 0 | 0 | 0 | 0 |
| 27.02.2024 17:00 - 18:00 | 0 | 0 | 0 | 0 |
| 27.02.2024 18:00 - 19:00 | 0 | 0 | 0 | 0 |
| 27.02.2024 19:00 - 20:00 | 0 | 0 | 0 | 0 |
| 27.02.2024 20:00 - 21:00 | 0 | 0 | 0 | 0 |
| 27.02.2024 21:00 - 22:00 | 0 | -50 | 0 | 0 |
| 27.02.2024 22:00 - 23:00 | 0 | -50 | 0 | 0 |
| 27.02.2024 23:00 - 24:00 | 0 | -50 | 0 | 0 |
| 28.02.2024 00:00 - 01:00 | 0 | -50 | 0 | 0 |
| 28.02.2024 01:00 - 02:00 | 0 | -50 | 0 | 0 |
| 28.02.2024 02:00 - 03:00 | 0 | -150 | 0 | 0 |
| 28.02.2024 03:00 - 04:00 | 0 | -150 | 0 | 0 |
| 28.02.2024 04:00 - 05:00 | 0 | -150 | 0 | 0 |
| 28.02.2024 05:00 - 06:00 | 0 | -150 | 0 | 0 |
| 28.02.2024 06:00 - 07:00 | 0 | 0 | 0 | 0 |
| 28.02.2024 07:00 - 08:00 | 0 | 0 | 0 | 0 |
| 28.02.2024 08:00 - 09:00 | 0 | 0 | 0 | 0 |
| 28.02.2024 09:00 - 10:00 | 0 | 0 | 0 | 0 |
| 28.02.2024 10:00 - 11:00 | 0 | 0 | 0 | 0 |
| 28.02.2024 11:00 - 12:00 | 0 | 0 | 0 | 0 |
| 28.02.2024 12:00 - 13:00 | 0 | 0 | 0 | 0 |
| 28.02.2024 13:00 - 14:00 | 0 | 0 | 0 | 0 |
| 28.02.2024 14:00 - 15:00 | 0 | 0 | 0 | 0 |
| 28.02.2024 15:00 - 16:00 | 0 | 0 | 0 | 0 |
| 28.02.2024 16:00 - 17:00 | 0 | 0 | 0 | 0 |
| 28.02.2024 17:00 - 18:00 | 0 | 0 | 0 | 0 |
| 28.02.2024 18:00 - 19:00 | 0 | 0 | 0 | 0 |
| 28.02.2024 19:00 - 20:00 | 0 | -20 | 0 | 0 |
| 28.02.2024 20:00 - 21:00 | 0 | -20 | 0 | 0 |
| 28.02.2024 21:00 - 22:00 | 0 | -20 | 0 | 0 |
| 28.02.2024 22:00 - 23:00 | 0 | -20 | 0 | 0 |
| 28.02.2024 23:00 - 24:00 | 0 | -20 | 0 | 0 |
| 29.02.2024 00:00 - 01:00 | 0 | -70 | 0 | 0 |
| 29.02.2024 01:00 - 02:00 | 0 | -120 | 0 | 0 |
| 29.02.2024 02:00 - 03:00 | 0 | -120 | 0 | 0 |
| 29.02.2024 03:00 - 04:00 | 0 | -120 | 0 | 0 |
| 29.02.2024 04:00 - 05:00 | 0 | -120 | 0 | 0 |
| 29.02.2024 05:00 - 06:00 | 0 | -120 | 0 | 0 |
| 29.02.2024 06:00 - 07:00 | 0 | 0 | 0 | 0 |
| 29.02.2024 07:00 - 08:00 | 0 | 0 | 0 | 0 |
| 29.02.2024 08:00 - 09:00 | 0 | 0 | 0 | 0 |
| 29.02.2024 09:00 - 10:00 | 0 | 0 | 0 | 0 |
| 29.02.2024 10:00 - 11:00 | 0 | 0 | 0 | 0 |
| 29.02.2024 11:00 - 12:00 | 0 | 0 | 0 | 0 |
| 29.02.2024 12:00 - 13:00 | 0 | 0 | 0 | 0 |
| 29.02.2024 13:00 - 14:00 | 0 | 0 | 0 | 0 |
| 29.02.2024 14:00 - 15:00 | 0 | 0 | 0 | 0 |
| 29.02.2024 15:00 - 16:00 | 0 | 0 | 0 | 0 |
| 29.02.2024 16:00 - 17:00 | 0 | -60 | 0 | 0 |
| 29.02.2024 17:00 - 18:00 | 0 | -60 | 0 | 0 |
| 29.02.2024 18:00 - 19:00 | 0 | -60 | 0 | 0 |
| 29.02.2024 19:00 - 20:00 | 0 | -60 | 0 | 0 |
| 29.02.2024 20:00 - 21:00 | 0 | -120 | 0 | 0 |
| 29.02.2024 21:00 - 22:00 | 0 | -120 | 0 | 0 |
| 29.02.2024 22:00 - 23:00 | 0 | -120 | 0 | 0 |
| 29.02.2024 23:00 - 24:00 | 0 | -120 | 0 | 0 |
| 01.03.2024 00:00 - 01:00 | 0 | -120 | 0 | 0 |
| 01.03.2024 01:00 - 02:00 | 0 | -120 | 0 | 0 |
| 01.03.2024 02:00 - 03:00 | 0 | -120 | 0 | 0 |
| 01.03.2024 03:00 - 04:00 | 0 | -120 | 0 | 0 |
| 01.03.2024 04:00 - 05:00 | 0 | -120 | 0 | 0 |
| 01.03.2024 05:00 - 06:00 | 0 | -120 | 0 | 0 |